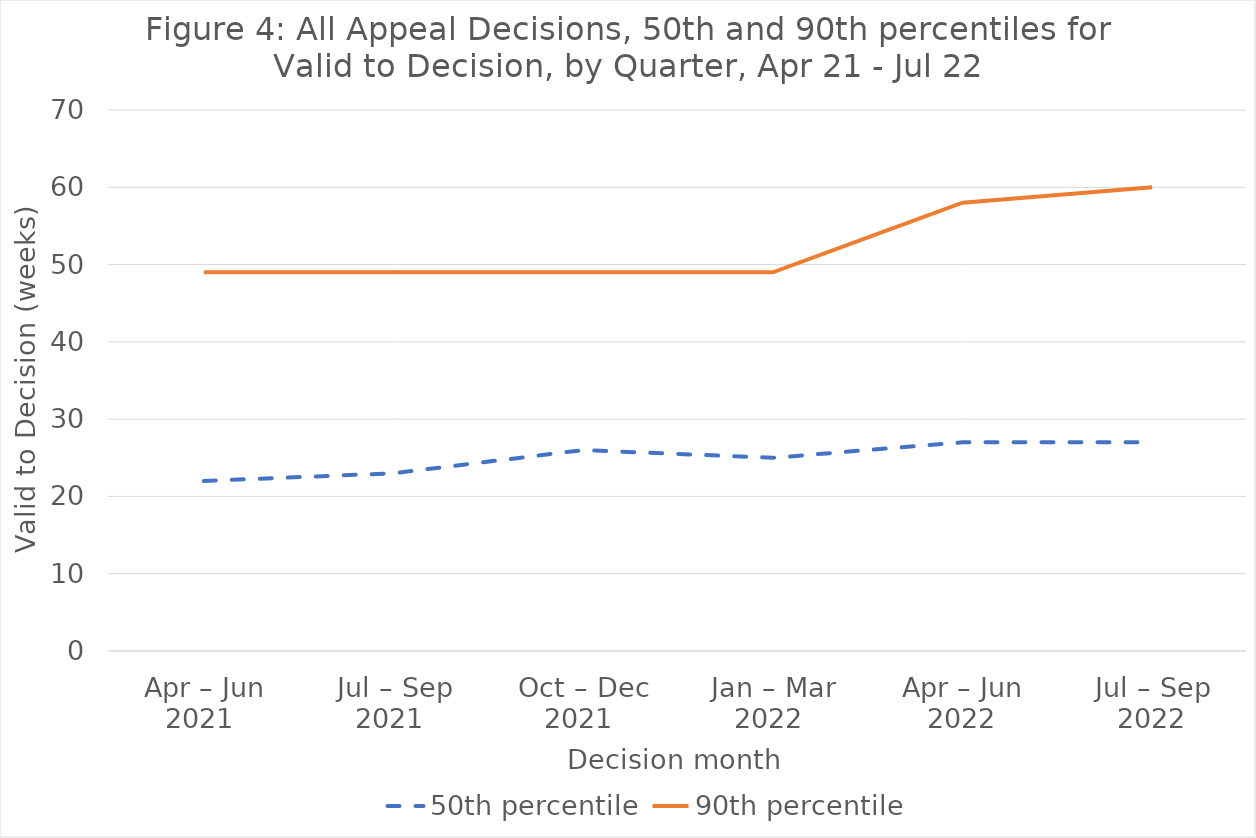
| Category | 50th percentile | 90th percentile |
|---|---|---|
| Apr – Jun 2021  | 22 | 49 |
| Jul – Sep 2021  | 23 | 49 |
| Oct – Dec 2021  | 26 | 49 |
| Jan – Mar 2022  | 25 | 49 |
| Apr – Jun 2022 | 27 | 58 |
| Jul – Sep 2022 | 27 | 60 |